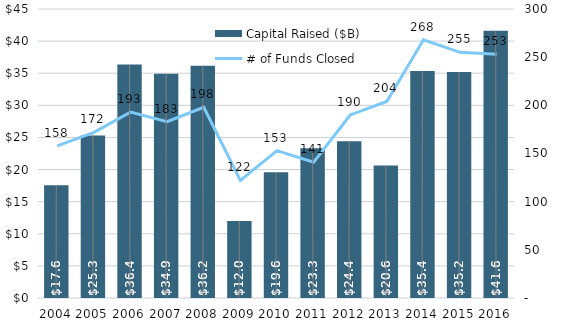
| Category | Capital Raised ($B) |
|---|---|
| 2004.0 | 17.564 |
| 2005.0 | 25.299 |
| 2006.0 | 36.351 |
| 2007.0 | 34.918 |
| 2008.0 | 36.176 |
| 2009.0 | 12.008 |
| 2010.0 | 19.572 |
| 2011.0 | 23.314 |
| 2012.0 | 24.421 |
| 2013.0 | 20.641 |
| 2014.0 | 35.351 |
| 2015.0 | 35.171 |
| 2016.0 | 41.625 |